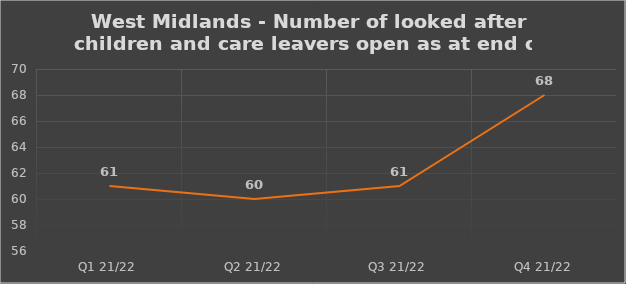
| Category | Number of open cases  |
|---|---|
| Q1 21/22 | 61 |
| Q2 21/22 | 60 |
| Q3 21/22 | 61 |
| Q4 21/22 | 68 |